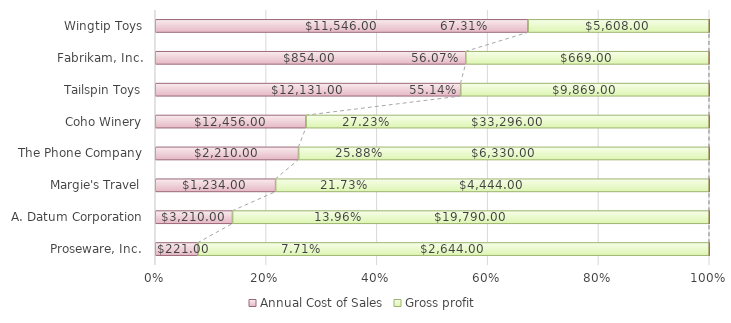
| Category | Annual Cost of Sales | Gross profit | Cost of sales % |
|---|---|---|---|
| Proseware, Inc. | 221 | 2644 | 0.077 |
| A. Datum Corporation | 3210 | 19790 | 0.14 |
| Margie's Travel | 1234 | 4444 | 0.217 |
| The Phone Company | 2210 | 6330 | 0.259 |
| Coho Winery | 12456 | 33296 | 0.272 |
| Tailspin Toys | 12131 | 9869 | 0.551 |
| Fabrikam, Inc. | 854 | 669 | 0.561 |
| Wingtip Toys | 11546 | 5608 | 0.673 |